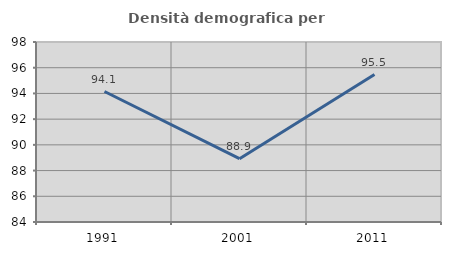
| Category | Densità demografica |
|---|---|
| 1991.0 | 94.149 |
| 2001.0 | 88.926 |
| 2011.0 | 95.472 |